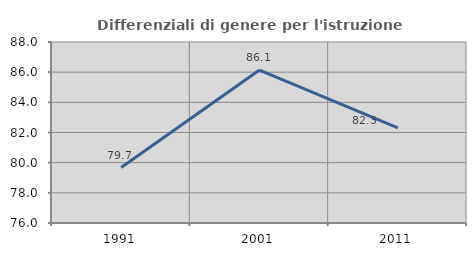
| Category | Differenziali di genere per l'istruzione superiore |
|---|---|
| 1991.0 | 79.674 |
| 2001.0 | 86.14 |
| 2011.0 | 82.301 |